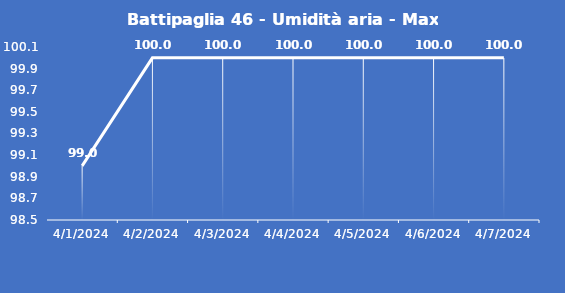
| Category | Battipaglia 46 - Umidità aria - Max (%) |
|---|---|
| 4/1/24 | 99 |
| 4/2/24 | 100 |
| 4/3/24 | 100 |
| 4/4/24 | 100 |
| 4/5/24 | 100 |
| 4/6/24 | 100 |
| 4/7/24 | 100 |